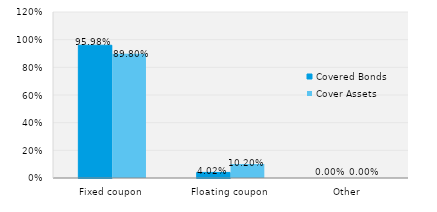
| Category | Covered Bonds | Cover Assets |
|---|---|---|
| Fixed coupon | 0.96 | 0.898 |
| Floating coupon | 0.04 | 0.102 |
| Other | 0 | 0 |